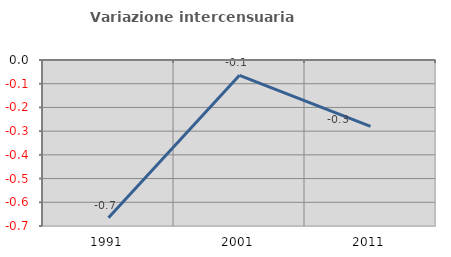
| Category | Variazione intercensuaria annua |
|---|---|
| 1991.0 | -0.665 |
| 2001.0 | -0.065 |
| 2011.0 | -0.28 |